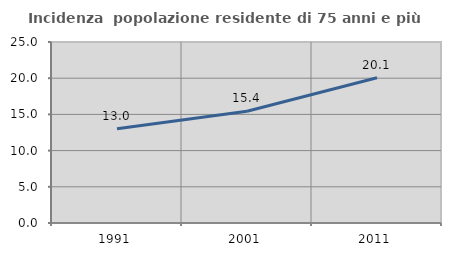
| Category | Incidenza  popolazione residente di 75 anni e più |
|---|---|
| 1991.0 | 13.032 |
| 2001.0 | 15.431 |
| 2011.0 | 20.062 |